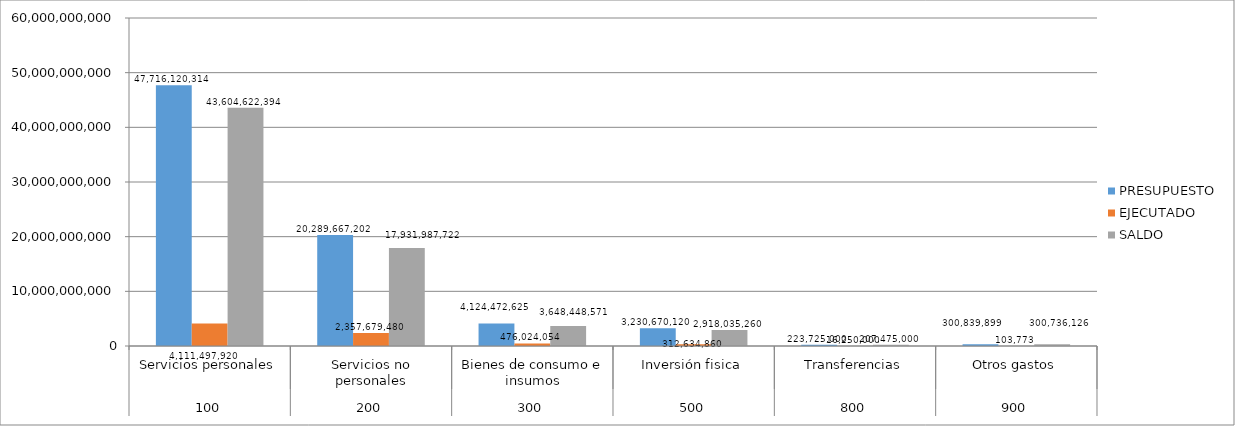
| Category | PRESUPUESTO | EJECUTADO | SALDO |
|---|---|---|---|
| 0 | 47716120314 | 4111497920 | 43604622394 |
| 1 | 20289667202 | 2357679480 | 17931987722 |
| 2 | 4124472625 | 476024054 | 3648448571 |
| 3 | 3230670120 | 312634860 | 2918035260 |
| 4 | 223725000 | 16250000 | 207475000 |
| 5 | 300839899 | 103773 | 300736126 |